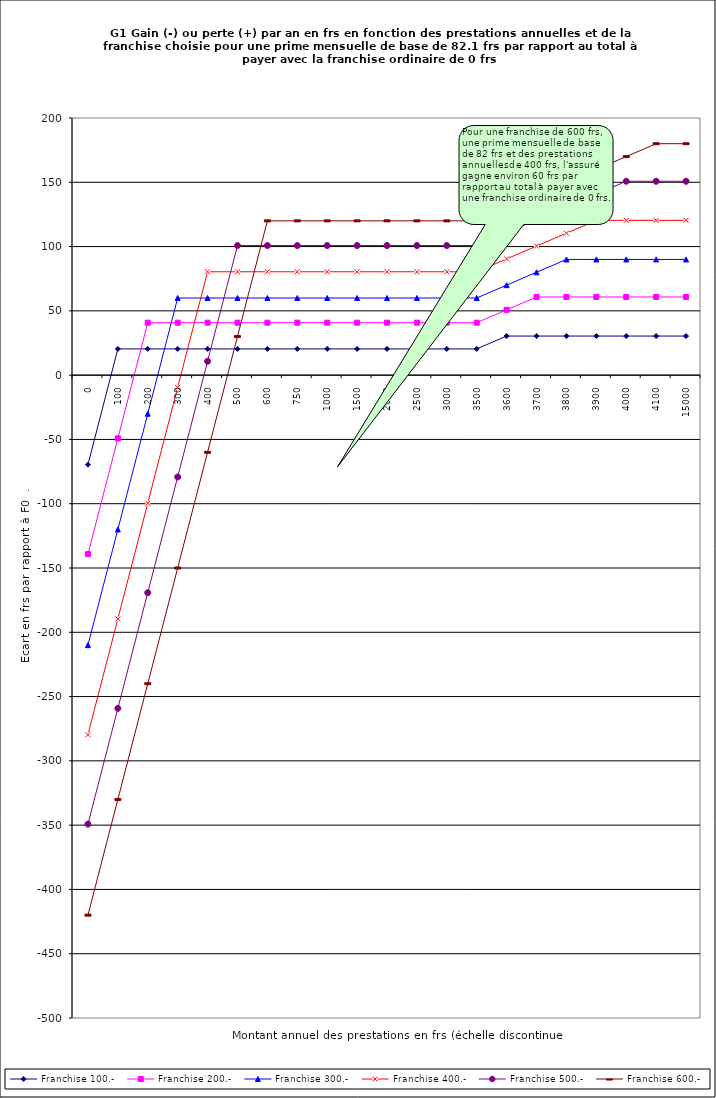
| Category | Franchise 100.- | Franchise 200.- | Franchise 300.- | Franchise 400.- | Franchise 500.- | Franchise 600.- |
|---|---|---|---|---|---|---|
| 0.0 | -69.6 | -139.2 | -210 | -279.6 | -349.2 | -420 |
| 100.0 | 20.4 | -49.2 | -120 | -189.6 | -259.2 | -330 |
| 200.0 | 20.4 | 40.8 | -30 | -99.6 | -169.2 | -240 |
| 300.0 | 20.4 | 40.8 | 60 | -9.6 | -79.2 | -150 |
| 400.0 | 20.4 | 40.8 | 60 | 80.4 | 10.8 | -60 |
| 500.0 | 20.4 | 40.8 | 60 | 80.4 | 100.8 | 30 |
| 600.0 | 20.4 | 40.8 | 60 | 80.4 | 100.8 | 120 |
| 750.0 | 20.4 | 40.8 | 60 | 80.4 | 100.8 | 120 |
| 1000.0 | 20.4 | 40.8 | 60 | 80.4 | 100.8 | 120 |
| 1500.0 | 20.4 | 40.8 | 60 | 80.4 | 100.8 | 120 |
| 2000.0 | 20.4 | 40.8 | 60 | 80.4 | 100.8 | 120 |
| 2500.0 | 20.4 | 40.8 | 60 | 80.4 | 100.8 | 120 |
| 3000.0 | 20.4 | 40.8 | 60 | 80.4 | 100.8 | 120 |
| 3500.0 | 20.4 | 40.8 | 60 | 80.4 | 100.8 | 120 |
| 3600.0 | 30.4 | 50.8 | 70 | 90.4 | 110.8 | 130 |
| 3700.0 | 30.4 | 60.8 | 80 | 100.4 | 120.8 | 140 |
| 3800.0 | 30.4 | 60.8 | 90 | 110.4 | 130.8 | 150 |
| 3900.0 | 30.4 | 60.8 | 90 | 120.4 | 140.8 | 160 |
| 4000.0 | 30.4 | 60.8 | 90 | 120.4 | 150.8 | 170 |
| 4100.0 | 30.4 | 60.8 | 90 | 120.4 | 150.8 | 180 |
| 15000.0 | 30.4 | 60.8 | 90 | 120.4 | 150.8 | 180 |